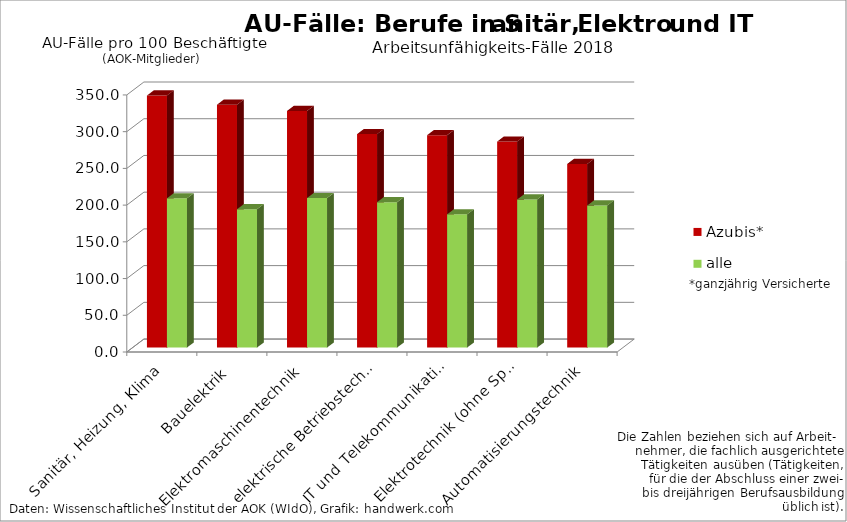
| Category | Azubis* | alle Beschäftigte* |
|---|---|---|
| Sanitär, Heizung, Klima | 343.181 | 203.216 |
| Bauelektrik | 330.719 | 188.311 |
| Elektromaschinentechnik | 322.23 | 203.602 |
| elektrische Betriebstechnik | 290.655 | 197.968 |
| IT und Telekommunikation | 289.24 | 181.413 |
| Elektrotechnik (ohne Spez.) | 280.522 | 201.584 |
| Automatisierungstechnik | 250.018 | 193.418 |